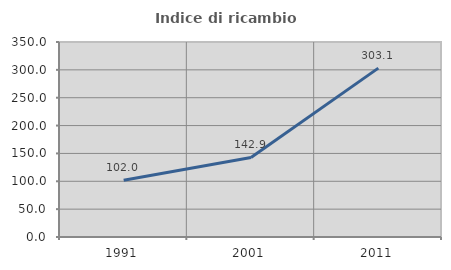
| Category | Indice di ricambio occupazionale  |
|---|---|
| 1991.0 | 102 |
| 2001.0 | 142.857 |
| 2011.0 | 303.125 |